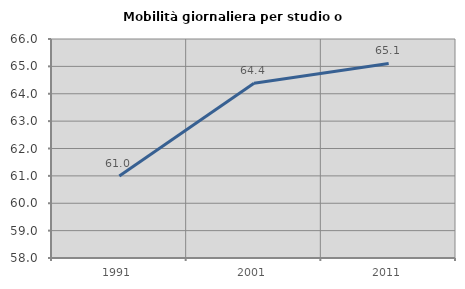
| Category | Mobilità giornaliera per studio o lavoro |
|---|---|
| 1991.0 | 60.996 |
| 2001.0 | 64.384 |
| 2011.0 | 65.105 |